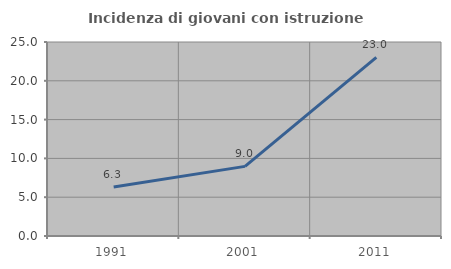
| Category | Incidenza di giovani con istruzione universitaria |
|---|---|
| 1991.0 | 6.316 |
| 2001.0 | 8.974 |
| 2011.0 | 23.009 |